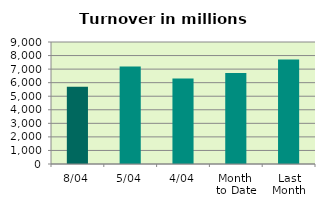
| Category | Series 0 |
|---|---|
| 8/04 | 5691.533 |
| 5/04 | 7193.467 |
| 4/04 | 6313.804 |
| Month 
to Date | 6721.266 |
| Last
Month | 7711.184 |